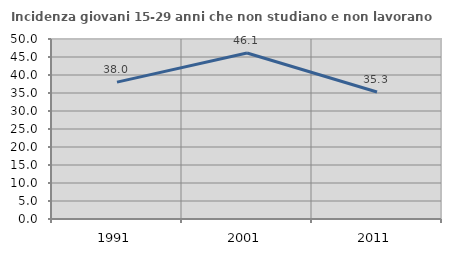
| Category | Incidenza giovani 15-29 anni che non studiano e non lavorano  |
|---|---|
| 1991.0 | 38.023 |
| 2001.0 | 46.119 |
| 2011.0 | 35.264 |